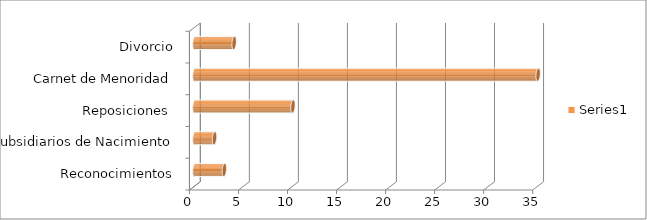
| Category | Series 0 |
|---|---|
| Reconocimientos | 3 |
| Subsidiarios de Nacimiento | 2 |
| Reposiciones  | 10 |
| Carnet de Menoridad | 35 |
| Divorcio | 4 |